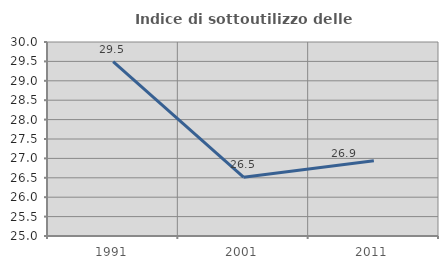
| Category | Indice di sottoutilizzo delle abitazioni  |
|---|---|
| 1991.0 | 29.493 |
| 2001.0 | 26.515 |
| 2011.0 | 26.939 |